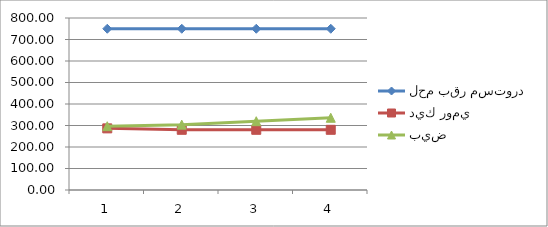
| Category | لحم بقر مستورد | ديك رومي | بيض |
|---|---|---|---|
| 0 | 750 | 286.67 | 296.67 |
| 1 | 750 | 280 | 304 |
| 2 | 750 | 280 | 320 |
| 3 | 750 | 280 | 336 |